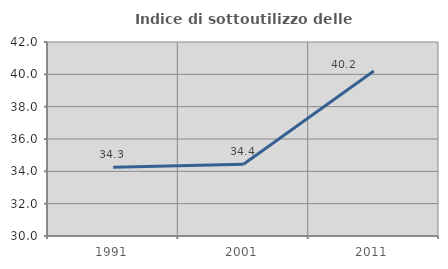
| Category | Indice di sottoutilizzo delle abitazioni  |
|---|---|
| 1991.0 | 34.253 |
| 2001.0 | 34.442 |
| 2011.0 | 40.204 |